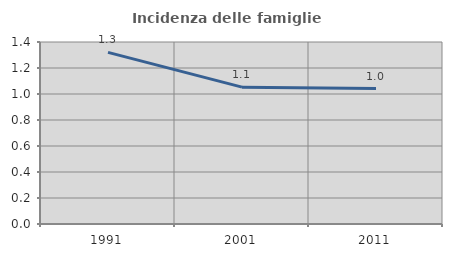
| Category | Incidenza delle famiglie numerose |
|---|---|
| 1991.0 | 1.32 |
| 2001.0 | 1.053 |
| 2011.0 | 1.042 |